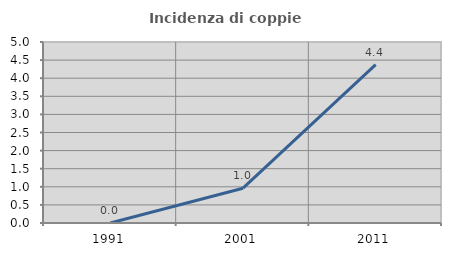
| Category | Incidenza di coppie miste |
|---|---|
| 1991.0 | 0 |
| 2001.0 | 0.962 |
| 2011.0 | 4.377 |